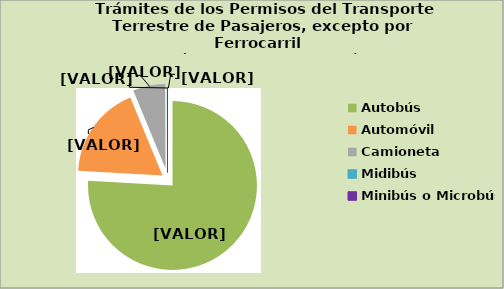
| Category | Series 0 |
|---|---|
| Autobús | 75.918 |
| Automóvil | 17.851 |
| Camioneta | 6.173 |
| Midibús | 0.012 |
| Minibús o Microbús | 0.047 |